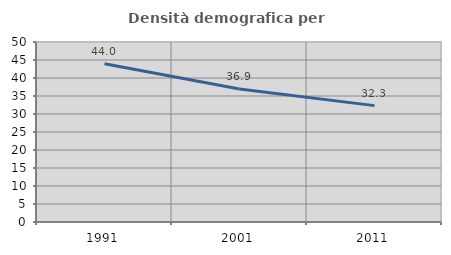
| Category | Densità demografica |
|---|---|
| 1991.0 | 43.972 |
| 2001.0 | 36.937 |
| 2011.0 | 32.324 |